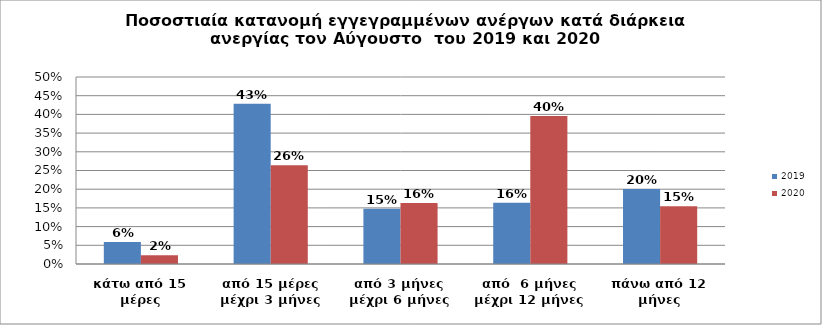
| Category | 2019 | 2020 |
|---|---|---|
| κάτω από 15 μέρες | 0.059 | 0.023 |
| από 15 μέρες μέχρι 3 μήνες | 0.429 | 0.264 |
| από 3 μήνες μέχρι 6 μήνες | 0.147 | 0.163 |
| από  6 μήνες μέχρι 12 μήνες | 0.164 | 0.396 |
| πάνω από 12 μήνες | 0.201 | 0.154 |